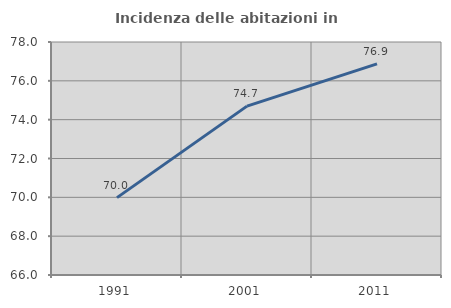
| Category | Incidenza delle abitazioni in proprietà  |
|---|---|
| 1991.0 | 69.986 |
| 2001.0 | 74.696 |
| 2011.0 | 76.871 |